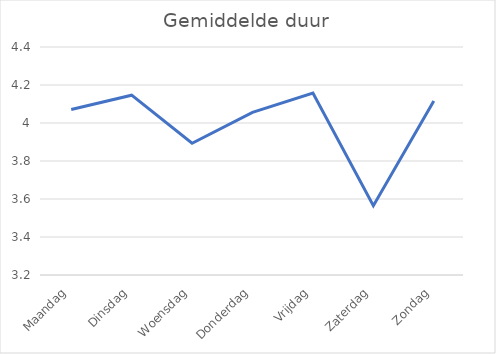
| Category | Gemiddelde duur |
|---|---|
| Maandag | 4.071 |
| Dinsdag | 4.146 |
| Woensdag | 3.893 |
| Donderdag | 4.056 |
| Vrijdag | 4.157 |
| Zaterdag | 3.565 |
| Zondag | 4.116 |